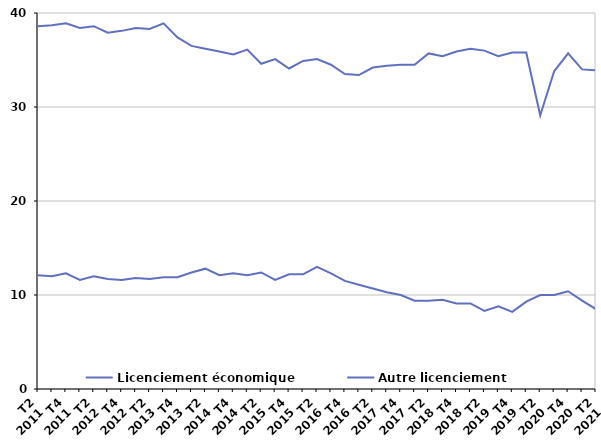
| Category | Licenciement économique | Autre licenciement |
|---|---|---|
| T2
2011 | 12.1 | 38.6 |
| T3
2011 | 12 | 38.7 |
| T4
2011 | 12.3 | 38.9 |
| T1
2012 | 11.6 | 38.4 |
| T2
2012 | 12 | 38.6 |
| T3
2012 | 11.7 | 37.9 |
| T4
2012 | 11.6 | 38.1 |
| T1
2013 | 11.8 | 38.4 |
| T2
2013 | 11.7 | 38.3 |
| T3
2013 | 11.9 | 38.9 |
| T4
2013 | 11.9 | 37.4 |
| T1
2014 | 12.4 | 36.5 |
| T2
2014 | 12.8 | 36.2 |
| T3
2014 | 12.1 | 35.9 |
| T4
2014 | 12.3 | 35.6 |
| T1
2015 | 12.1 | 36.1 |
| T2
2015 | 12.4 | 34.6 |
| T3
2015 | 11.6 | 35.1 |
| T4
2015 | 12.2 | 34.1 |
| T1
2016 | 12.2 | 34.9 |
| T2
2016 | 13 | 35.1 |
| T3
2016 | 12.3 | 34.5 |
| T4
2016 | 11.5 | 33.5 |
| T1
2017 | 11.1 | 33.4 |
| T2
2017 | 10.7 | 34.2 |
| T3
2017 | 10.3 | 34.4 |
| T4
2017 | 10 | 34.5 |
| T1
2018 | 9.4 | 34.5 |
| T2
2018 | 9.4 | 35.7 |
| T3
2018 | 9.5 | 35.4 |
| T4
2018 | 9.1 | 35.9 |
| T1
2019 | 9.1 | 36.2 |
| T2
2019 | 8.3 | 36 |
| T3
2019 | 8.8 | 35.4 |
| T4
2019 | 8.2 | 35.8 |
| T1
2020 | 9.3 | 35.8 |
| T2
2020 | 10 | 29.1 |
| T3
2020 | 10 | 33.8 |
| T4
2020 | 10.4 | 35.7 |
| T1
2021 | 9.4 | 34 |
| T2
2021 | 8.5 | 33.9 |